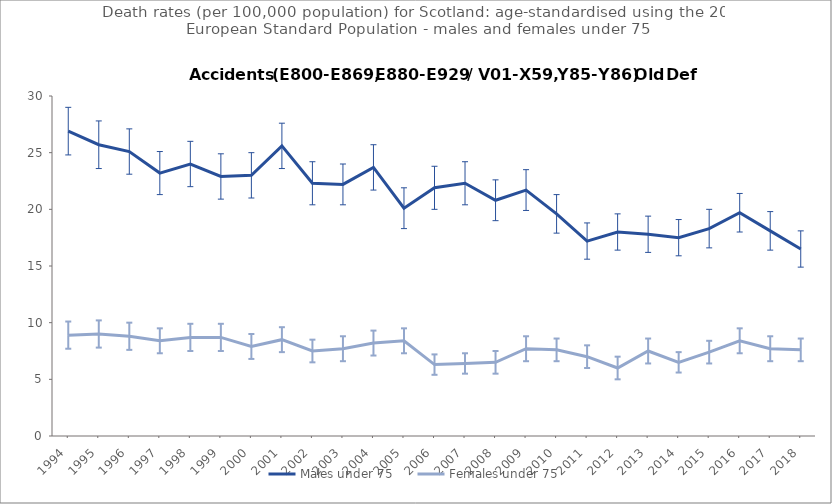
| Category | Males under 75 | Females under 75 |
|---|---|---|
| 1994.0 | 26.9 | 8.9 |
| 1995.0 | 25.7 | 9 |
| 1996.0 | 25.1 | 8.8 |
| 1997.0 | 23.2 | 8.4 |
| 1998.0 | 24 | 8.7 |
| 1999.0 | 22.9 | 8.7 |
| 2000.0 | 23 | 7.9 |
| 2001.0 | 25.6 | 8.5 |
| 2002.0 | 22.3 | 7.5 |
| 2003.0 | 22.2 | 7.7 |
| 2004.0 | 23.7 | 8.2 |
| 2005.0 | 20.1 | 8.4 |
| 2006.0 | 21.9 | 6.3 |
| 2007.0 | 22.3 | 6.4 |
| 2008.0 | 20.8 | 6.5 |
| 2009.0 | 21.7 | 7.7 |
| 2010.0 | 19.6 | 7.6 |
| 2011.0 | 17.2 | 7 |
| 2012.0 | 18 | 6 |
| 2013.0 | 17.8 | 7.5 |
| 2014.0 | 17.5 | 6.5 |
| 2015.0 | 18.3 | 7.4 |
| 2016.0 | 19.7 | 8.4 |
| 2017.0 | 18.1 | 7.7 |
| 2018.0 | 16.5 | 7.6 |